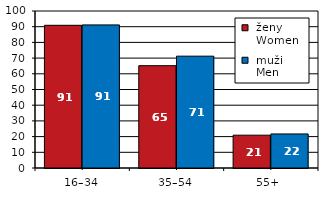
| Category |  ženy 
 Women |  muži 
 Men |
|---|---|---|
| 16–34 | 90.892 | 91.135 |
| 35–54 | 65.171 | 71.232 |
| 55+  | 20.9 | 21.687 |